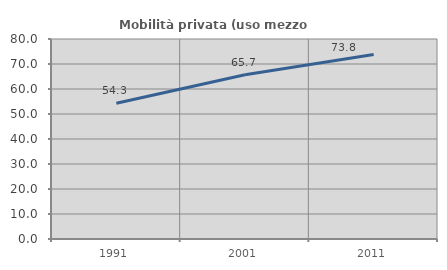
| Category | Mobilità privata (uso mezzo privato) |
|---|---|
| 1991.0 | 54.301 |
| 2001.0 | 65.686 |
| 2011.0 | 73.82 |